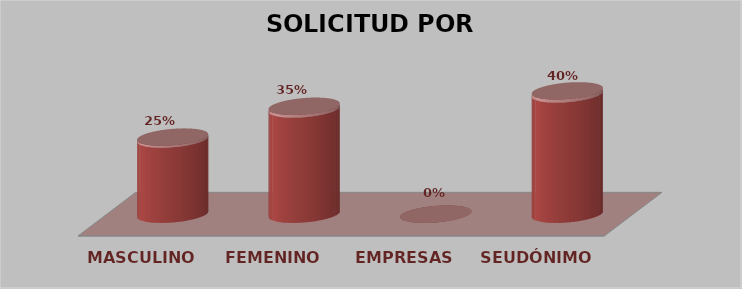
| Category | SOLICITUD POR GÉNERO | Series 1 |
|---|---|---|
| MASCULINO | 10 | 0.25 |
| FEMENINO | 14 | 0.35 |
| EMPRESAS | 0 | 0 |
| SEUDÓNIMO | 16 | 0.4 |